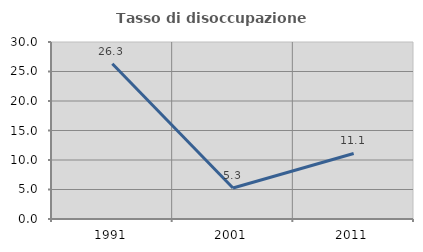
| Category | Tasso di disoccupazione giovanile  |
|---|---|
| 1991.0 | 26.316 |
| 2001.0 | 5.263 |
| 2011.0 | 11.111 |